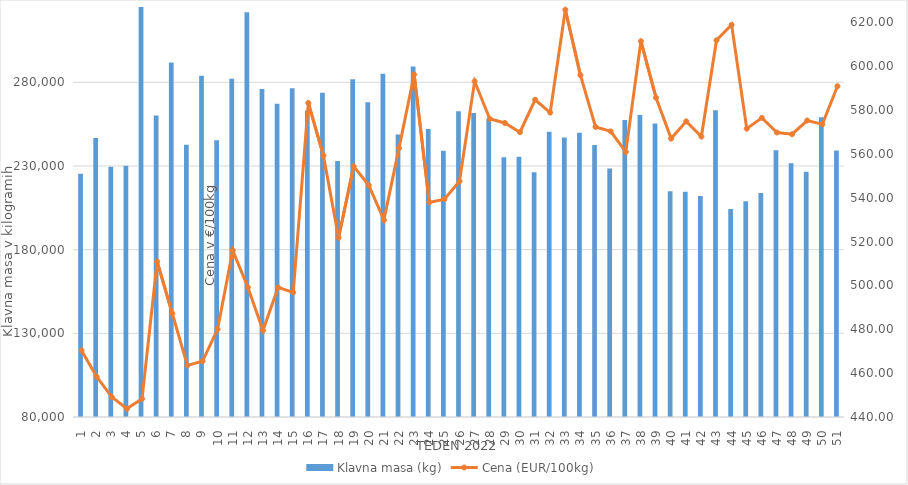
| Category | Klavna masa (kg) |
|---|---|
| 1.0 | 225300 |
| 2.0 | 246712 |
| 3.0 | 229541 |
| 4.0 | 230074 |
| 5.0 | 328640 |
| 6.0 | 260108 |
| 7.0 | 291887 |
| 8.0 | 242732 |
| 9.0 | 283987 |
| 10.0 | 245414 |
| 11.0 | 282092 |
| 12.0 | 321936 |
| 13.0 | 275950 |
| 14.0 | 267148 |
| 15.0 | 276417 |
| 16.0 | 263098 |
| 17.0 | 273824 |
| 18.0 | 232926 |
| 19.0 | 281859 |
| 20.0 | 268153 |
| 21.0 | 285073 |
| 22.0 | 248783 |
| 23.0 | 289478 |
| 24.0 | 252069 |
| 25.0 | 239099 |
| 26.0 | 262689 |
| 27.0 | 261656 |
| 28.0 | 257905 |
| 29.0 | 235185 |
| 30.0 | 235475 |
| 31.0 | 226322 |
| 32.0 | 250418 |
| 33.0 | 246996 |
| 34.0 | 249873 |
| 35.0 | 242516 |
| 36.0 | 228469 |
| 37.0 | 257511 |
| 38.0 | 260481 |
| 39.0 | 255370 |
| 40.0 | 214936 |
| 41.0 | 214672 |
| 42.0 | 212066 |
| 43.0 | 263287 |
| 44.0 | 204280 |
| 45.0 | 208920 |
| 46.0 | 213836 |
| 47.0 | 239417 |
| 48.0 | 231565 |
| 49.0 | 226575 |
| 50.0 | 259073 |
| 51.0 | 239211 |